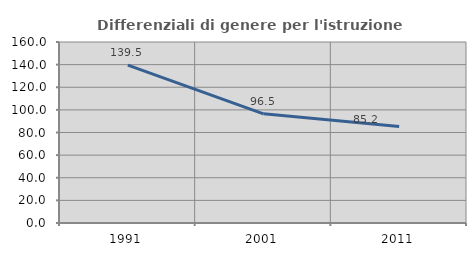
| Category | Differenziali di genere per l'istruzione superiore |
|---|---|
| 1991.0 | 139.483 |
| 2001.0 | 96.537 |
| 2011.0 | 85.201 |